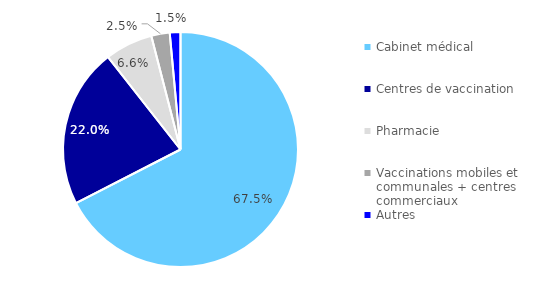
| Category | Nombre de doses |
|---|---|
| Cabinet médical | 0.675 |
| Centres de vaccination | 0.22 |
| Pharmacie | 0.066 |
| Vaccinations mobiles et communales + centres commerciaux | 0.025 |
| Autres | 0.015 |